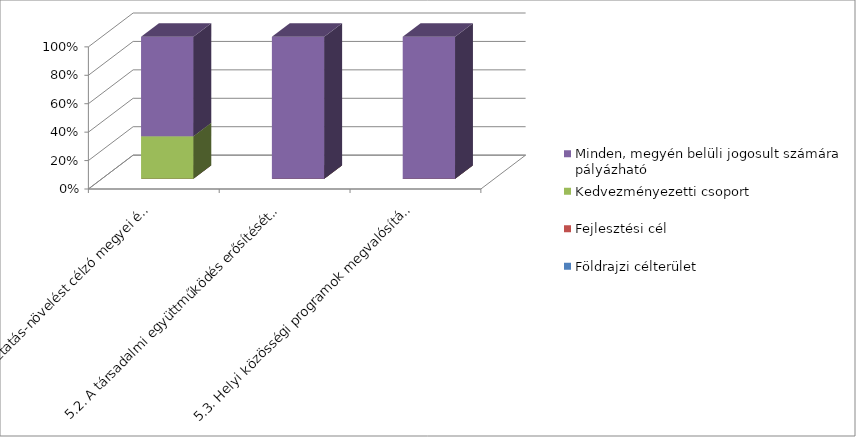
| Category | Földrajzi célterület  | Fejlesztési cél  | Kedvezményezetti csoport | Minden, megyén belüli jogosult számára pályázható   |
|---|---|---|---|---|
| 5.1. Foglalkoztatás-növelést célzó megyei és helyi foglalkoztatási együttműködések (paktumok) | 0 | 0 | 0.3 | 0.7 |
| 5.2. A társadalmi együttműködés erősítését szolgáló helyi szintű komplex programok  | 0 | 0 | 0 | 1 |
| 5.3. Helyi közösségi programok megvalósítása | 0 | 0 | 0 | 1 |